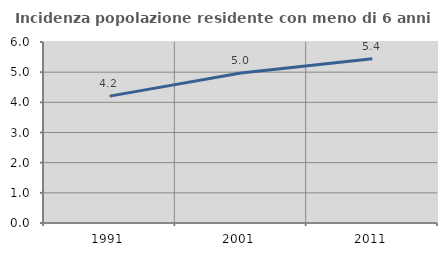
| Category | Incidenza popolazione residente con meno di 6 anni |
|---|---|
| 1991.0 | 4.206 |
| 2001.0 | 4.97 |
| 2011.0 | 5.448 |